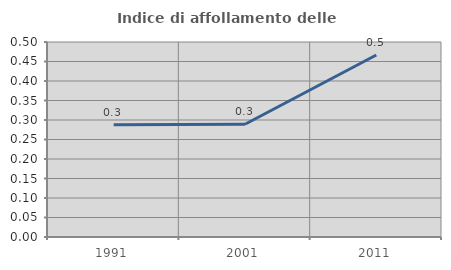
| Category | Indice di affollamento delle abitazioni  |
|---|---|
| 1991.0 | 0.288 |
| 2001.0 | 0.289 |
| 2011.0 | 0.467 |